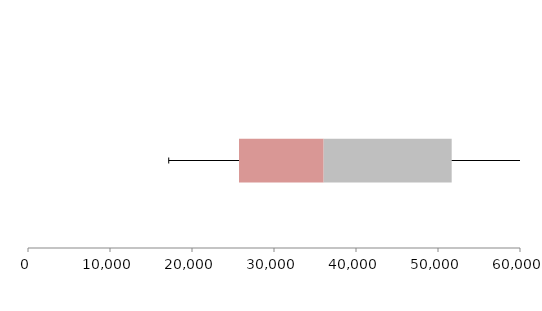
| Category | Series 1 | Series 2 | Series 3 |
|---|---|---|---|
| 0 | 25733.76 | 10320.066 | 15614.593 |